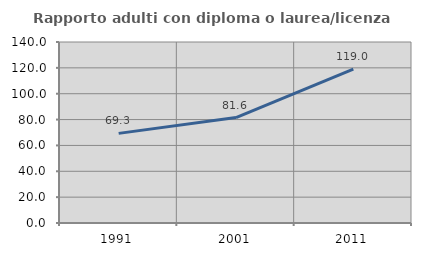
| Category | Rapporto adulti con diploma o laurea/licenza media  |
|---|---|
| 1991.0 | 69.333 |
| 2001.0 | 81.579 |
| 2011.0 | 119 |